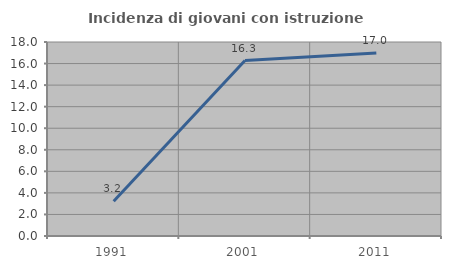
| Category | Incidenza di giovani con istruzione universitaria |
|---|---|
| 1991.0 | 3.226 |
| 2001.0 | 16.279 |
| 2011.0 | 16.981 |